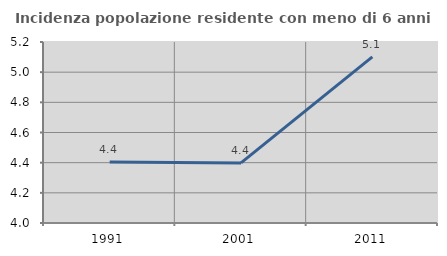
| Category | Incidenza popolazione residente con meno di 6 anni |
|---|---|
| 1991.0 | 4.405 |
| 2001.0 | 4.398 |
| 2011.0 | 5.101 |